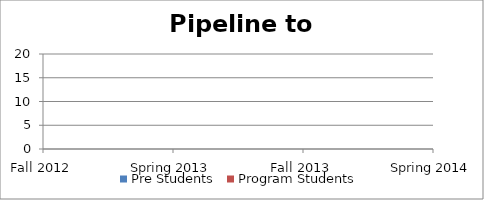
| Category | Pre Students | Program Students |
|---|---|---|
| Fall 2012 | 0 | 0 |
| Spring 2013 | 0 | 0 |
| Fall 2013 | 0 | 0 |
| Spring 2014 | 0 | 0 |